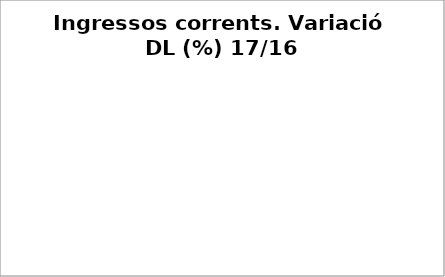
| Category | Series 0 |
|---|---|
| Impostos locals | 0.028 |
| Participació Tributs de l'Estat | 0 |
| Taxes i altres ingressos | -0.063 |
| Transferències corrents (exc. FCF) | 1.653 |
| Ingressos patrimonials | 0.276 |
| Ingressos corrents | 0.031 |